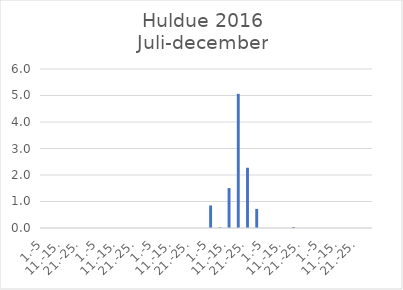
| Category | Series 0 |
|---|---|
| 1.-5 | 0 |
| 6.-10. | 0 |
| 11.-15. | 0 |
| 16.-20. | 0 |
| 21.-25. | 0 |
| 26.-31. | 0 |
| 1.-5 | 0 |
| 6.-10. | 0 |
| 11.-15. | 0 |
| 16.-20. | 0 |
| 21.-25. | 0 |
| 26.-31. | 0 |
| 1.-5 | 0 |
| 6.-10. | 0 |
| 11.-15. | 0 |
| 16.-20. | 0 |
| 21.-25. | 0 |
| 26.-30. | 0 |
| 1.-5 | 0.851 |
| 6.-10. | 0.024 |
| 11.-15. | 1.506 |
| 16.-20. | 5.063 |
| 21.-25. | 2.273 |
| 26.-31. | 0.719 |
| 1.-5 | 0 |
| 6.-10. | 0 |
| 11.-15. | 0 |
| 16.-20. | 0.038 |
| 21.-25. | 0 |
| 26.-30. | 0 |
| 1.-5 | 0 |
| 6.-10. | 0 |
| 11.-15. | 0 |
| 16.-20. | 0 |
| 21.-25. | 0 |
| 26.-31. | 0 |